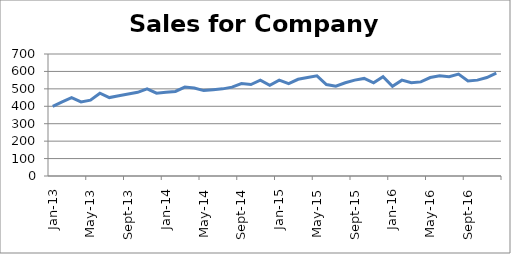
| Category | Sales |
|---|---|
| 2013-01-01 | 400 |
| 2013-02-01 | 425 |
| 2013-03-01 | 450 |
| 2013-04-01 | 425 |
| 2013-05-01 | 435 |
| 2013-06-01 | 475 |
| 2013-07-01 | 450 |
| 2013-08-01 | 460 |
| 2013-09-01 | 470 |
| 2013-10-01 | 480 |
| 2013-11-01 | 500 |
| 2013-12-01 | 475 |
| 2014-01-01 | 480 |
| 2014-02-01 | 485 |
| 2014-03-01 | 510 |
| 2014-04-01 | 505 |
| 2014-05-01 | 490 |
| 2014-06-01 | 495 |
| 2014-07-01 | 500 |
| 2014-08-01 | 510 |
| 2014-09-01 | 530 |
| 2014-10-01 | 525 |
| 2014-11-01 | 550 |
| 2014-12-01 | 520 |
| 2015-01-01 | 550 |
| 2015-02-01 | 530 |
| 2015-03-01 | 555 |
| 2015-04-01 | 565 |
| 2015-05-01 | 575 |
| 2015-06-01 | 525 |
| 2015-07-01 | 515 |
| 2015-08-01 | 535 |
| 2015-09-01 | 550 |
| 2015-10-01 | 560 |
| 2015-11-01 | 535 |
| 2015-12-01 | 570 |
| 2016-01-01 | 515 |
| 2016-02-01 | 550 |
| 2016-03-01 | 535 |
| 2016-04-01 | 540 |
| 2016-05-01 | 565 |
| 2016-06-01 | 575 |
| 2016-07-01 | 570 |
| 2016-08-01 | 585 |
| 2016-09-01 | 545 |
| 2016-10-01 | 550 |
| 2016-11-01 | 565 |
| 2016-12-01 | 590 |